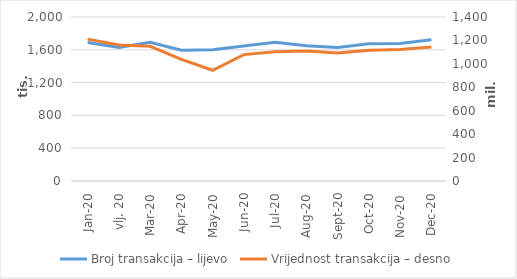
| Category | Broj transakcija – lijevo |
|---|---|
| sij.20 | 1689658 |
| vlj. 20 | 1628932 |
| ožu.20 | 1690846 |
| tra.20 | 1593917 |
| svi.20 | 1601244 |
| lip.20 | 1645690 |
| srp.20 | 1691157 |
| kol.20 | 1649626 |
| ruj.20 | 1627483 |
| lis.20 | 1672488 |
| stu.20 | 1675992 |
| pro.20 | 1722990 |